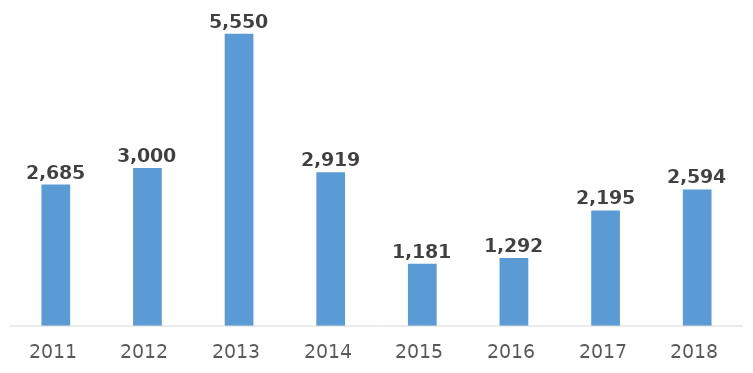
| Category | Interessi passivi sui conti di tesoreria |
|---|---|
| 2011.0 | 2684.787 |
| 2012.0 | 3000 |
| 2013.0 | 5550 |
| 2014.0 | 2919.432 |
| 2015.0 | 1181.156 |
| 2016.0 | 1292.429 |
| 2017.0 | 2194.788 |
| 2018.0 | 2593.733 |